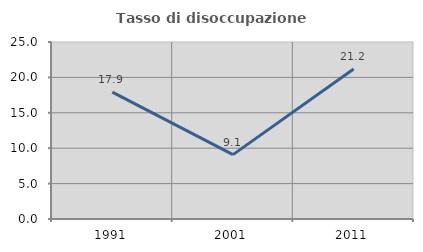
| Category | Tasso di disoccupazione giovanile  |
|---|---|
| 1991.0 | 17.912 |
| 2001.0 | 9.091 |
| 2011.0 | 21.186 |